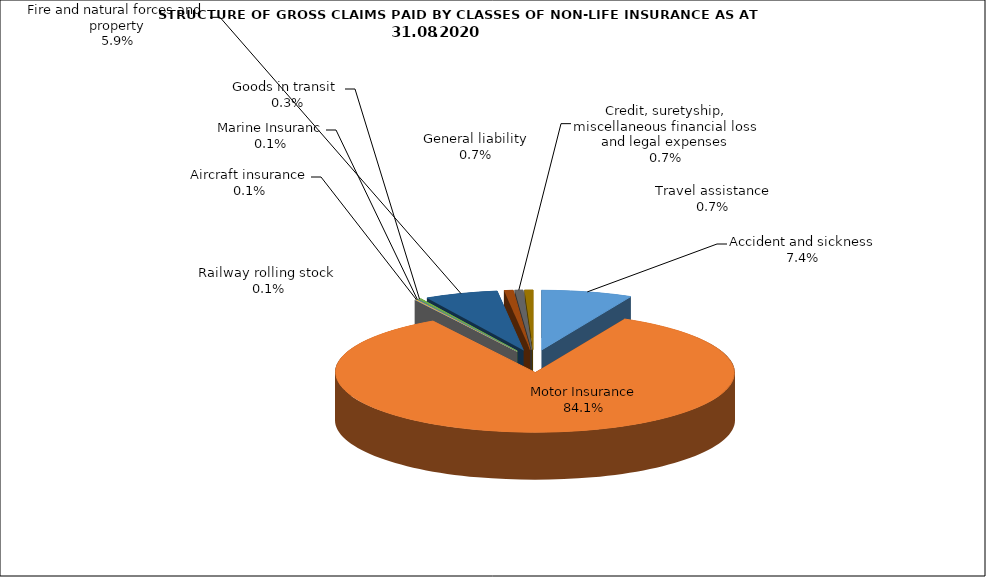
| Category | Accident and sickness | Series 1 |
|---|---|---|
| Accident and sickness | 0.074 |  |
| Motor Insurance | 0.841 |  |
| Railway rolling stock  | 0.001 |  |
| Aircraft insurance | 0.001 |  |
| Marine Insuranc | 0.001 |  |
| Goods in transit  | 0.003 |  |
| Fire and natural forces and property | 0.059 |  |
| General liability | 0.007 |  |
| Credit, suretyship, miscellaneous financial loss and legal expenses | 0.007 |  |
| Travel assistance | 0.007 |  |